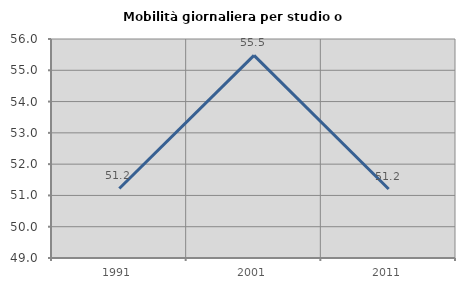
| Category | Mobilità giornaliera per studio o lavoro |
|---|---|
| 1991.0 | 51.222 |
| 2001.0 | 55.478 |
| 2011.0 | 51.207 |